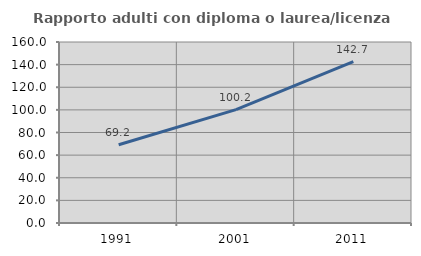
| Category | Rapporto adulti con diploma o laurea/licenza media  |
|---|---|
| 1991.0 | 69.18 |
| 2001.0 | 100.249 |
| 2011.0 | 142.686 |